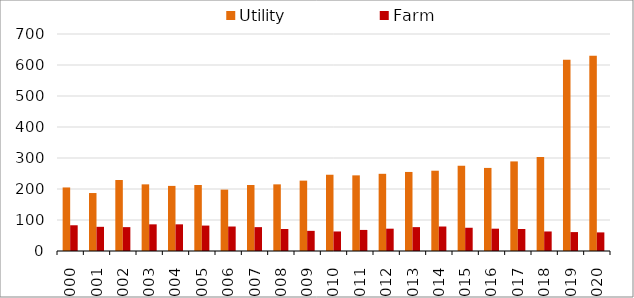
| Category | Utility | Farm |
|---|---|---|
| 2000.0 | 205 | 83 |
| 2001.0 | 187 | 78 |
| 2002.0 | 229 | 77 |
| 2003.0 | 215 | 86 |
| 2004.0 | 210 | 86 |
| 2005.0 | 213 | 82 |
| 2006.0 | 198 | 79 |
| 2007.0 | 213 | 77 |
| 2008.0 | 215 | 71 |
| 2009.0 | 227 | 65 |
| 2010.0 | 246 | 63 |
| 2011.0 | 244 | 68 |
| 2012.0 | 249 | 72 |
| 2013.0 | 255 | 77 |
| 2014.0 | 259 | 79 |
| 2015.0 | 275 | 75 |
| 2016.0 | 268 | 72 |
| 2017.0 | 289 | 71 |
| 2018.0 | 303 | 63 |
| 2019.0 | 617 | 61 |
| 2020.0 | 630 | 60 |